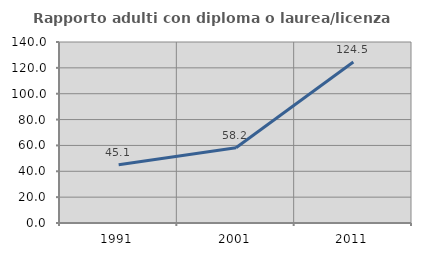
| Category | Rapporto adulti con diploma o laurea/licenza media  |
|---|---|
| 1991.0 | 45.102 |
| 2001.0 | 58.236 |
| 2011.0 | 124.499 |